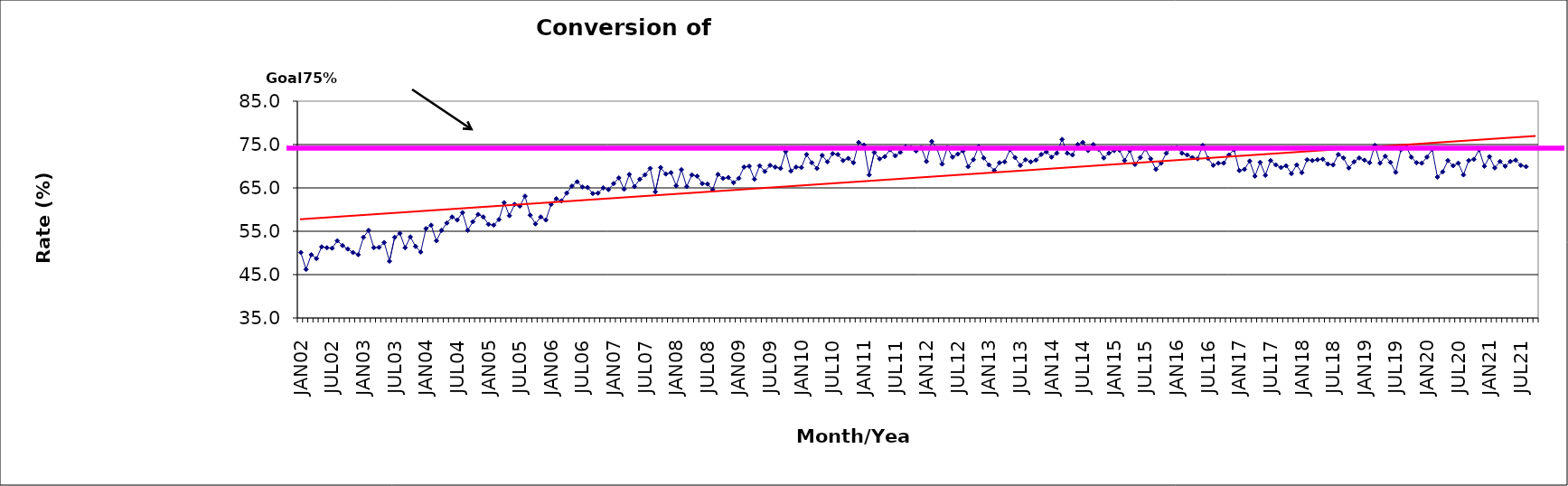
| Category | Series 0 |
|---|---|
| JAN02 | 50.1 |
| FEB02 | 46.2 |
| MAR02 | 49.6 |
| APR02 | 48.7 |
| MAY02 | 51.4 |
| JUN02 | 51.2 |
| JUL02 | 51.1 |
| AUG02 | 52.8 |
| SEP02 | 51.7 |
| OCT02 | 50.9 |
| NOV02 | 50.1 |
| DEC02 | 49.6 |
| JAN03 | 53.6 |
| FEB03 | 55.2 |
| MAR03 | 51.2 |
| APR03 | 51.3 |
| MAY03 | 52.4 |
| JUN03 | 48.1 |
| JUL03 | 53.6 |
| AUG03 | 54.5 |
| SEP03 | 51.2 |
| OCT03 | 53.7 |
| NOV03 | 51.5 |
| DEC03 | 50.2 |
| JAN04 | 55.6 |
| FEB04 | 56.4 |
| MAR04 | 52.8 |
| APR04 | 55.2 |
| MAY04 | 56.9 |
| JUN04 | 58.3 |
| JUL04 | 57.6 |
| AUG04 | 59.3 |
| SEP04 | 55.2 |
| OCT04 | 57.2 |
| NOV04 | 58.9 |
| DEC04 | 58.3 |
| JAN05 | 56.6 |
| FEB05 | 56.4 |
| MAR05 | 57.7 |
| APR05 | 61.6 |
| MAY05 | 58.6 |
| JUN05 | 61.2 |
| JUL05 | 60.8 |
| AUG05 | 63.1 |
| SEP05 | 58.7 |
| OCT05 | 56.7 |
| NOV05 | 58.3 |
| DEC05 | 57.6 |
| JAN06 | 61.2 |
| FEB06 | 62.5 |
| MAR06 | 62 |
| APR06 | 63.8 |
| MAY06 | 65.4 |
| JUN06 | 66.4 |
| JUL06 | 65.2 |
| AUG06 | 65.1 |
| SEP06 | 63.7 |
| OCT06 | 63.8 |
| NOV06 | 65 |
| DEC06 | 64.6 |
| JAN07 | 66 |
| FEB07 | 67.3 |
| MAR07 | 64.7 |
| APR07 | 68.1 |
| MAY07 | 65.3 |
| JUN07 | 67 |
| JUL07 | 68 |
| AUG07 | 69.5 |
| SEP07 | 64.1 |
| OCT07 | 69.7 |
| NOV07 | 68.2 |
| DEC07 | 68.5 |
| JAN08 | 65.5 |
| FEB08 | 69.2 |
| MAR08 | 65.3 |
| APR08 | 68 |
| MAY08 | 67.7 |
| JUN08 | 66 |
| JUL08 | 65.9 |
| AUG08 | 64.6 |
| SEP08 | 68.1 |
| OCT08 | 67.2 |
| NOV08 | 67.4 |
| DEC08 | 66.2 |
| JAN09 | 67.2 |
| FEB09 | 69.8 |
| MAR09 | 70 |
| APR09 | 67 |
| MAY09 | 70.1 |
| JUN09 | 68.8 |
| JUL09 | 70.2 |
| AUG09 | 69.8 |
| SEP09 | 69.5 |
| OCT09 | 73.4 |
| NOV09 | 68.9 |
| DEC09 | 69.8 |
| JAN10 | 69.7 |
| FEB10 | 72.7 |
| MAR10 | 70.8 |
| APR10 | 69.5 |
| MAY10 | 72.5 |
| JUN10 | 71 |
| JUL10 | 72.9 |
| AUG10 | 72.7 |
| SEP10 | 71.3 |
| OCT10 | 71.8 |
| NOV10 | 70.8 |
| DEC10 | 75.5 |
| JAN11 | 74.9 |
| FEB11 | 68 |
| MAR11 | 73.2 |
| APR11 | 71.7 |
| MAY11 | 72.2 |
| JUN11 | 73.8 |
| JUL11 | 72.4 |
| AUG11 | 73.2 |
| SEP11 | 74.5 |
| OCT11 | 74.3 |
| NOV11 | 73.5 |
| DEC11 | 74.3 |
| JAN12 | 71.1 |
| FEB12 | 75.7 |
| MAR12 | 74.1 |
| APR12 | 70.5 |
| MAY12 | 74.3 |
| JUN12 | 72.1 |
| JUL12 | 72.8 |
| AUG12 | 73.5 |
| SEP12 | 69.9 |
| OCT12 | 71.5 |
| NOV12 | 74.5 |
| DEC12 | 71.9 |
| JAN13 | 70.3 |
| FEB13 | 69 |
| MAR13 | 70.8 |
| APR13 | 71 |
| MAY13 | 73.8 |
| JUN13 | 72 |
| JUL13 | 70.2 |
| AUG13 | 71.5 |
| SEP13 | 71 |
| OCT13 | 71.4 |
| NOV13 | 72.7 |
| DEC13 | 73.3 |
| JAN14 | 72.1 |
| FEB14 | 73 |
| MAR14 | 76.2 |
| APR14 | 73 |
| MAY14 | 72.6 |
| JUN14 | 75 |
| JUL14 | 75.5 |
| AUG14 | 73.6 |
| SEP14 | 75 |
| OCT14 | 73.9 |
| NOV14 | 71.9 |
| DEC14 | 73 |
| JAN15 | 73.6 |
| FEB15 | 73.7 |
| MAR15 | 71.3 |
| APR15 | 73.6 |
| MAY15 | 70.4 |
| JUN15 | 72 |
| JUL15 | 74 |
| AUG15 | 71.7 |
| SEP15 | 69.3 |
| OCT15 | 70.7 |
| NOV15 | 73 |
| DEC15 | 74.2 |
| JAN16 | 74.3 |
| FEB16 | 73 |
| MAR16 | 72.6 |
| APR16 | 72 |
| MAY16 | 71.7 |
| JUN16 | 74.8 |
| JUL16 | 71.8 |
| AUG16 | 70.2 |
| SEP16 | 70.7 |
| OCT16 | 70.7 |
| NOV16 | 72.6 |
| DEC16 | 73.8 |
| JAN17 | 69 |
| FEB17 | 69.3 |
| MAR17 | 71.2 |
| APR17 | 67.7 |
| MAY17 | 70.9 |
| JUN17 | 67.9 |
| JUL17 | 71.3 |
| AUG17 | 70.3 |
| SEP17 | 69.7 |
| OCT17 | 70.1 |
| NOV17 | 68.3 |
| DEC17 | 70.3 |
| JAN18 | 68.5 |
| FEB18 | 71.5 |
| MAR18 | 71.3 |
| APR18 | 71.5 |
| MAY18 | 71.6 |
| JUN18 | 70.5 |
| JUL18 | 70.3 |
| AUG18 | 72.7 |
| SEP18 | 71.9 |
| OCT18 | 69.6 |
| NOV18 | 71 |
| DEC18 | 71.9 |
| JAN19 | 71.4 |
| FEB19 | 70.8 |
| MAR19 | 74.8 |
| APR19 | 70.7 |
| MAY19 | 72.3 |
| JUN19 | 70.9 |
| JUL19 | 68.6 |
| AUG19 | 73.8 |
| SEP19 | 74.5 |
| OCT19 | 72.1 |
| NOV19 | 70.8 |
| DEC19 | 70.7 |
| JAN20 | 72.1 |
| FEB20 | 73.9 |
| MAR20 | 67.5 |
| APR20 | 68.7 |
| MAY20 | 71.3 |
| JUN20 | 70.1 |
| JUL20 | 70.7 |
| AUG20 | 68 |
| SEP20 | 71.3 |
| OCT20 | 71.6 |
| NOV20 | 73.8 |
| DEC20 | 70 |
| JAN21 | 72.2 |
| FEB21 | 69.6 |
| MAR21 | 71.1 |
| APR21 | 70 |
| MAY21 | 71.1 |
| JUN21 | 71.4 |
| JUL21 | 70.2 |
| AUG21 | 69.9 |